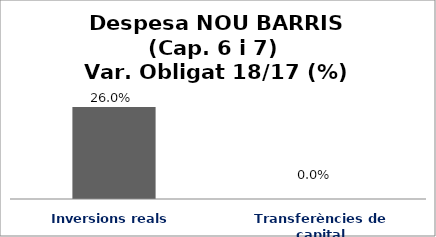
| Category | Series 0 |
|---|---|
| Inversions reals | 0.26 |
| Transferències de capital | 0 |